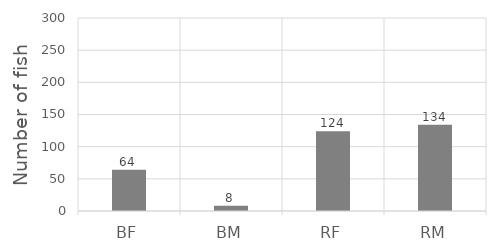
| Category | Series 0 |
|---|---|
| BF | 64 |
| BM | 8 |
| RF | 124 |
| RM | 134 |